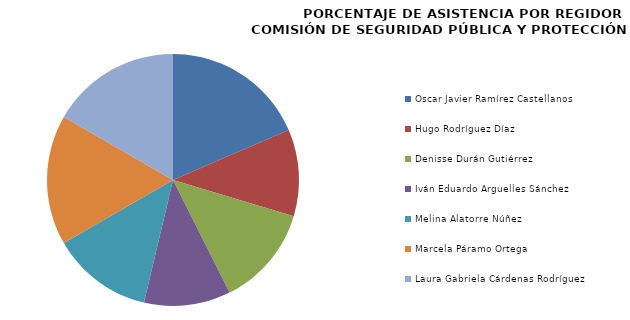
| Category | Series 0 |
|---|---|
| Oscar Javier Ramírez Castellanos | 100 |
| Hugo Rodríguez Díaz | 60 |
| Denisse Durán Gutiérrez | 70 |
| Iván Eduardo Arguelles Sánchez | 60 |
| Melina Alatorre Núñez | 70 |
| Marcela Páramo Ortega | 90 |
| Laura Gabriela Cárdenas Rodríguez | 90 |